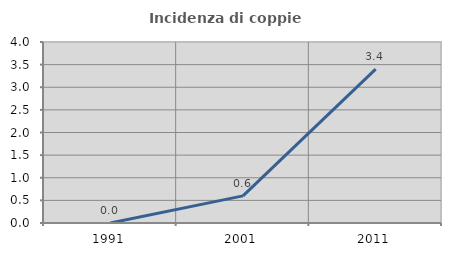
| Category | Incidenza di coppie miste |
|---|---|
| 1991.0 | 0 |
| 2001.0 | 0.599 |
| 2011.0 | 3.401 |